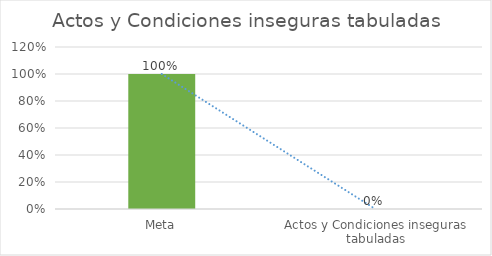
| Category | Series 0 |
|---|---|
| Meta | 1 |
| Actos y Condiciones inseguras tabuladas | 0 |